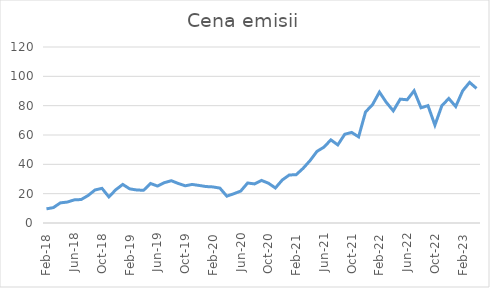
| Category | Series 0 |
|---|---|
| 2018-02-01 | 9.65 |
| 2018-03-01 | 10.51 |
| 2018-04-01 | 13.73 |
| 2018-05-01 | 14.27 |
| 2018-06-01 | 15.76 |
| 2018-07-01 | 16 |
| 2018-08-01 | 18.74 |
| 2018-09-01 | 22.52 |
| 2018-10-01 | 23.63 |
| 2018-11-01 | 17.79 |
| 2018-12-01 | 22.7 |
| 2019-01-01 | 26.3 |
| 2019-02-01 | 23.27 |
| 2019-03-01 | 22.52 |
| 2019-04-01 | 22.3 |
| 2019-05-01 | 26.95 |
| 2019-06-01 | 25.2 |
| 2019-07-01 | 27.5 |
| 2019-08-01 | 28.84 |
| 2019-09-01 | 26.95 |
| 2019-10-01 | 25.36 |
| 2019-11-01 | 26.3 |
| 2019-12-01 | 25.61 |
| 2020-01-01 | 24.86 |
| 2020-02-01 | 24.6 |
| 2020-03-01 | 23.8 |
| 2020-04-01 | 18.3 |
| 2020-05-01 | 19.94 |
| 2020-06-01 | 21.76 |
| 2020-07-01 | 27.27 |
| 2020-08-01 | 26.64 |
| 2020-09-01 | 29.02 |
| 2020-10-01 | 27.14 |
| 2020-11-01 | 23.88 |
| 2020-12-01 | 29.34 |
| 2021-01-01 | 32.72 |
| 2021-02-01 | 32.95 |
| 2021-03-01 | 37.28 |
| 2021-04-01 | 42.55 |
| 2021-05-01 | 48.84 |
| 2021-06-01 | 51.7 |
| 2021-07-01 | 56.68 |
| 2021-08-01 | 53.25 |
| 2021-09-01 | 60.51 |
| 2021-10-01 | 61.75 |
| 2021-11-01 | 58.73 |
| 2021-12-01 | 75.73 |
| 2022-01-01 | 80.65 |
| 2022-02-01 | 89.24 |
| 2022-03-01 | 82.21 |
| 2022-04-01 | 76.48 |
| 2022-05-01 | 84.45 |
| 2022-06-01 | 84.02 |
| 2022-07-01 | 90.16 |
| 2022-08-01 | 78.55 |
| 2022-09-01 | 80.03 |
| 2022-10-01 | 66.73 |
| 2022-11-01 | 79.97 |
| 2022-12-01 | 84.9 |
| 2023-01-01 | 79.4 |
| 2023-02-01 | 90.13 |
| 2023-03-01 | 95.88 |
| 2023-04-01 | 91.75 |